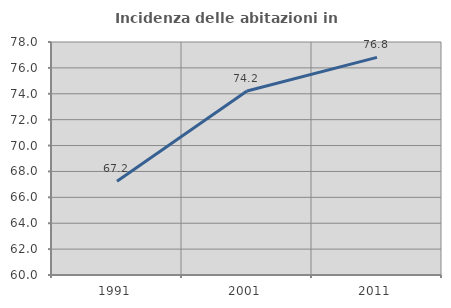
| Category | Incidenza delle abitazioni in proprietà  |
|---|---|
| 1991.0 | 67.245 |
| 2001.0 | 74.219 |
| 2011.0 | 76.812 |